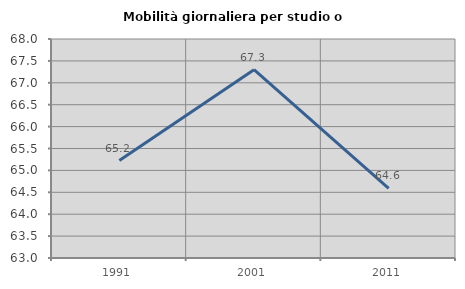
| Category | Mobilità giornaliera per studio o lavoro |
|---|---|
| 1991.0 | 65.224 |
| 2001.0 | 67.299 |
| 2011.0 | 64.588 |